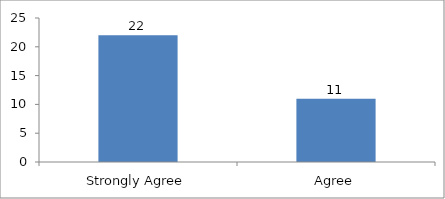
| Category | The speaker was knowledgeable about the topic? |
|---|---|
| Strongly Agree | 22 |
| Agree | 11 |